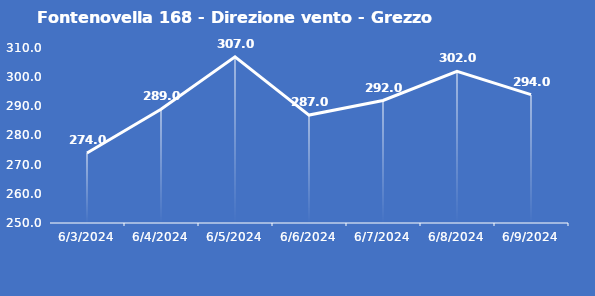
| Category | Fontenovella 168 - Direzione vento - Grezzo (°N) |
|---|---|
| 6/3/24 | 274 |
| 6/4/24 | 289 |
| 6/5/24 | 307 |
| 6/6/24 | 287 |
| 6/7/24 | 292 |
| 6/8/24 | 302 |
| 6/9/24 | 294 |